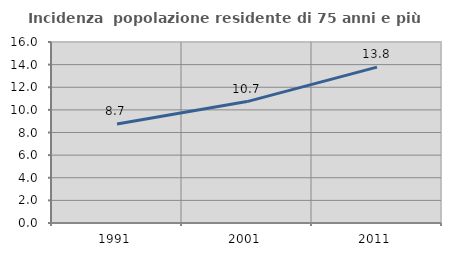
| Category | Incidenza  popolazione residente di 75 anni e più |
|---|---|
| 1991.0 | 8.746 |
| 2001.0 | 10.733 |
| 2011.0 | 13.782 |